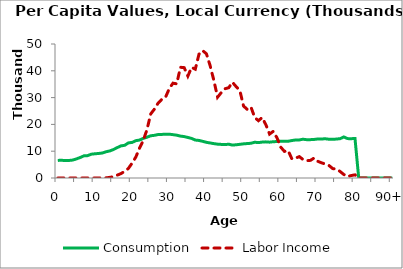
| Category | Consumption | Labor Income |
|---|---|---|
| 0 | 6567.825 | 0 |
|  | 6600.774 | 0 |
| 2 | 6526.194 | 0 |
| 3 | 6548.195 | 0 |
| 4 | 6689.459 | 0 |
| 5 | 7127.713 | 0 |
| 6 | 7633.441 | 0 |
| 7 | 8259.289 | 0 |
| 8 | 8345.54 | 0 |
| 9 | 8879.093 | 0 |
| 10 | 9041.902 | 8.348 |
| 11 | 9154.621 | 12.625 |
| 12 | 9331.158 | 25.89 |
| 13 | 9795.742 | 50.906 |
| 14 | 10106.696 | 242.914 |
| 15 | 10643.577 | 482.41 |
| 16 | 11350.388 | 1070.781 |
| 17 | 11991.27 | 1653.531 |
| 18 | 12207.296 | 2500.767 |
| 19 | 13102.243 | 3589.842 |
| 20 | 13280.712 | 5563.484 |
| 21 | 13922.904 | 7846.156 |
| 22 | 14164.568 | 11183.831 |
| 23 | 14781.519 | 14024.236 |
| 24 | 15221.737 | 18060.67 |
| 25 | 15761.296 | 23891.546 |
| 26 | 15924.616 | 25717.809 |
| 27 | 16222.321 | 27965.988 |
| 28 | 16275.253 | 29359.008 |
| 29 | 16284.867 | 30190.926 |
| 30 | 16347.376 | 33358.366 |
| 31 | 16171.615 | 35391.768 |
| 32 | 15974.98 | 35133.606 |
| 33 | 15634.373 | 41308.278 |
| 34 | 15459.422 | 41186.931 |
| 35 | 15123.322 | 38028.633 |
| 36 | 14770.236 | 41281.598 |
| 37 | 14160.903 | 40596.632 |
| 38 | 14011.709 | 46220.762 |
| 39 | 13679.866 | 47515.485 |
| 40 | 13313.639 | 46340.177 |
| 41 | 13070.816 | 41901.131 |
| 42 | 12829.332 | 36411.704 |
| 43 | 12631.863 | 30149.947 |
| 44 | 12534.537 | 31885.251 |
| 45 | 12465.827 | 33307.36 |
| 46 | 12612.241 | 33689.848 |
| 47 | 12279.374 | 35719.926 |
| 48 | 12400.293 | 34091.133 |
| 49 | 12566.206 | 32628.598 |
| 50 | 12739.532 | 26836.55 |
| 51 | 12854.649 | 25582.015 |
| 52 | 12958.956 | 26434.879 |
| 53 | 13344.632 | 22584.919 |
| 54 | 13201.82 | 21381.091 |
| 55 | 13394.715 | 22574.561 |
| 56 | 13483.575 | 19887.417 |
| 57 | 13370.309 | 16391.605 |
| 58 | 13537.584 | 17415.122 |
| 59 | 13601.636 | 14979.555 |
| 60 | 13712.488 | 11532.341 |
| 61 | 13703.56 | 9921.457 |
| 62 | 13712.325 | 10242.88 |
| 63 | 13986.501 | 7142.058 |
| 64 | 14188.24 | 7400.026 |
| 65 | 14203.352 | 7982.941 |
| 66 | 14470.681 | 6906.359 |
| 67 | 14297.372 | 6450.724 |
| 68 | 14312.636 | 6582.663 |
| 69 | 14391.714 | 7450.839 |
| 70 | 14559.895 | 6218.387 |
| 71 | 14563.774 | 5659.133 |
| 72 | 14634.069 | 5224.4 |
| 73 | 14461.985 | 4666.497 |
| 74 | 14444.56 | 3503.131 |
| 75 | 14525.174 | 3354.743 |
| 76 | 14678.005 | 2417.934 |
| 77 | 15323.908 | 1293.825 |
| 78 | 14695.028 | 514.847 |
| 79 | 14680.325 | 931.041 |
| 80 | 14723.193 | 1177.009 |
| 81 | 0 | 0 |
| 82 | 0 | 0 |
| 83 | 0 | 0 |
| 84 | 0 | 0 |
| 85 | 0 | 0 |
| 86 | 0 | 0 |
| 87 | 0 | 0 |
| 88 | 0 | 0 |
| 89 | 0 | 0 |
| 90+ | 0 | 0 |